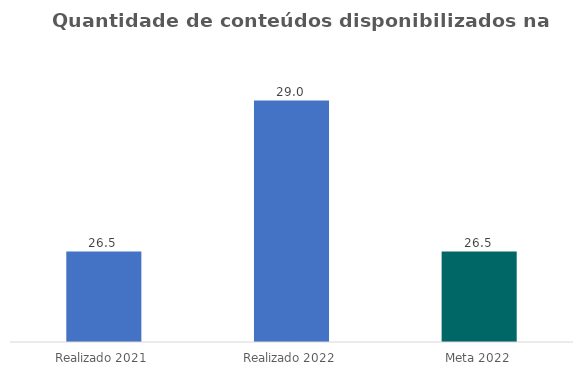
| Category | Series 0 |
|---|---|
| Realizado 2021 | 26.5 |
| Realizado 2022 | 29 |
| Meta 2022 | 26.5 |